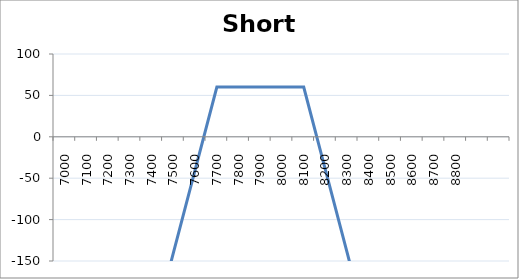
| Category | Series 0 |
|---|---|
| 7000.0 | -640 |
| 7100.0 | -540 |
| 7200.0 | -440 |
| 7300.0 | -340 |
| 7400.0 | -240 |
| 7500.0 | -140 |
| 7600.0 | -40 |
| 7700.0 | 60 |
| 7800.0 | 60 |
| 7900.0 | 60 |
| 8000.0 | 60 |
| 8100.0 | 60 |
| 8200.0 | -40 |
| 8300.0 | -140 |
| 8400.0 | -240 |
| 8500.0 | -340 |
| 8600.0 | -440 |
| 8700.0 | -540 |
| 8800.0 | -640 |